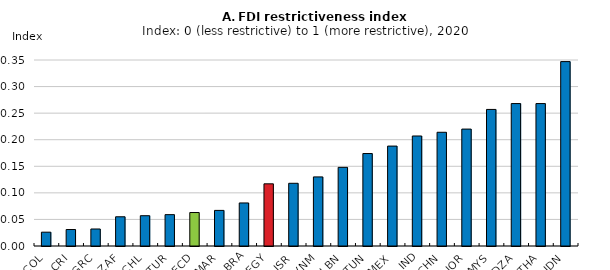
| Category | Total FDI Index |
|---|---|
| COL | 0.026 |
| CRI | 0.031 |
| GRC | 0.032 |
| ZAF | 0.055 |
| CHL | 0.057 |
| TUR | 0.059 |
| OECD | 0.063 |
| MAR | 0.067 |
| BRA | 0.081 |
| EGY | 0.117 |
| ISR | 0.118 |
| VNM | 0.13 |
| LBN | 0.148 |
| TUN | 0.174 |
| MEX | 0.188 |
| IND | 0.207 |
| CHN | 0.214 |
| JOR | 0.22 |
| MYS | 0.257 |
| DZA | 0.268 |
| THA | 0.268 |
| IDN | 0.347 |